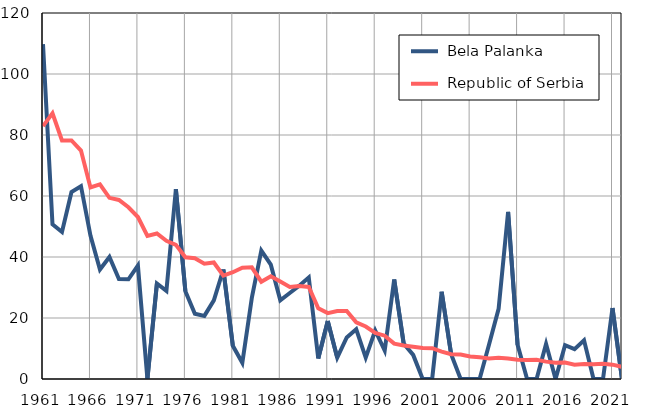
| Category |  Bela Palanka |  Republic of Serbia |
|---|---|---|
| 1961.0 | 109.8 | 82.9 |
| 1962.0 | 50.7 | 87.1 |
| 1963.0 | 48.2 | 78.2 |
| 1964.0 | 61.3 | 78.2 |
| 1965.0 | 63.2 | 74.9 |
| 1966.0 | 47 | 62.8 |
| 1967.0 | 35.9 | 63.8 |
| 1968.0 | 40 | 59.4 |
| 1969.0 | 32.8 | 58.7 |
| 1970.0 | 32.7 | 56.3 |
| 1971.0 | 37.2 | 53.1 |
| 1972.0 | 0 | 46.9 |
| 1973.0 | 31.3 | 47.7 |
| 1974.0 | 28.9 | 45.3 |
| 1975.0 | 62.2 | 44 |
| 1976.0 | 28.8 | 39.9 |
| 1977.0 | 21.4 | 39.6 |
| 1978.0 | 20.7 | 37.8 |
| 1979.0 | 25.8 | 38.2 |
| 1980.0 | 35.9 | 33.9 |
| 1981.0 | 10.9 | 35 |
| 1982.0 | 5.3 | 36.5 |
| 1983.0 | 26.6 | 36.6 |
| 1984.0 | 42.1 | 31.9 |
| 1985.0 | 37.5 | 33.7 |
| 1986.0 | 25.8 | 32 |
| 1987.0 | 28.2 | 30.2 |
| 1988.0 | 30.6 | 30.5 |
| 1989.0 | 33.3 | 30.2 |
| 1990.0 | 6.7 | 23.2 |
| 1991.0 | 19 | 21.6 |
| 1992.0 | 7 | 22.3 |
| 1993.0 | 13.6 | 22.3 |
| 1994.0 | 16.3 | 18.6 |
| 1995.0 | 7 | 17.2 |
| 1996.0 | 15.9 | 15.1 |
| 1997.0 | 9.3 | 14.2 |
| 1998.0 | 32.6 | 11.6 |
| 1999.0 | 11.6 | 11 |
| 2000.0 | 7.9 | 10.6 |
| 2001.0 | 0 | 10.2 |
| 2002.0 | 0 | 10.1 |
| 2003.0 | 28.6 | 9 |
| 2004.0 | 8.1 | 8.1 |
| 2005.0 | 0 | 8 |
| 2006.0 | 0 | 7.4 |
| 2007.0 | 0 | 7.1 |
| 2008.0 | 11.4 | 6.7 |
| 2009.0 | 23 | 7 |
| 2010.0 | 54.8 | 6.7 |
| 2011.0 | 11.2 | 6.3 |
| 2012.0 | 0 | 6.2 |
| 2013.0 | 0 | 6.3 |
| 2014.0 | 11.5 | 5.7 |
| 2015.0 | 0 | 5.3 |
| 2016.0 | 11.1 | 5.4 |
| 2017.0 | 9.8 | 4.7 |
| 2018.0 | 12.7 | 4.9 |
| 2019.0 | 0 | 4.8 |
| 2020.0 | 0 | 5 |
| 2021.0 | 23.3 | 4.7 |
| 2022.0 | 0 | 4 |